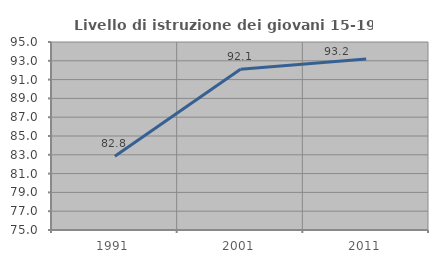
| Category | Livello di istruzione dei giovani 15-19 anni |
|---|---|
| 1991.0 | 82.841 |
| 2001.0 | 92.095 |
| 2011.0 | 93.204 |